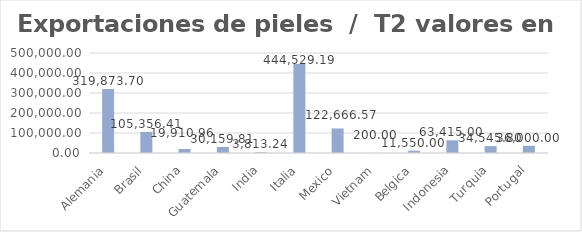
| Category | Valor US  |
|---|---|
| Alemania | 319873.696 |
| Brasil | 105356.406 |
| China | 19910.961 |
| Guatemala | 30159.811 |
| India | 3813.24 |
| Italia | 444529.188 |
| Mexico | 122666.57 |
| Vietnam | 200 |
| Belgica | 11550 |
| Indonesia | 63415 |
| Turquia | 34545.8 |
| Portugal | 36000 |